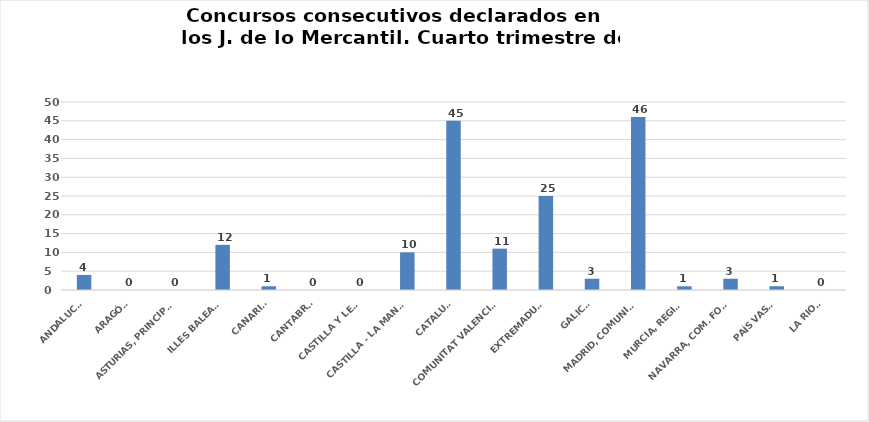
| Category | Series 0 |
|---|---|
| ANDALUCÍA | 4 |
| ARAGÓN | 0 |
| ASTURIAS, PRINCIPADO | 0 |
| ILLES BALEARS | 12 |
| CANARIAS | 1 |
| CANTABRIA | 0 |
| CASTILLA Y LEÓN | 0 |
| CASTILLA - LA MANCHA | 10 |
| CATALUÑA | 45 |
| COMUNITAT VALENCIANA | 11 |
| EXTREMADURA | 25 |
| GALICIA | 3 |
| MADRID, COMUNIDAD | 46 |
| MURCIA, REGIÓN | 1 |
| NAVARRA, COM. FORAL | 3 |
| PAÍS VASCO | 1 |
| LA RIOJA | 0 |